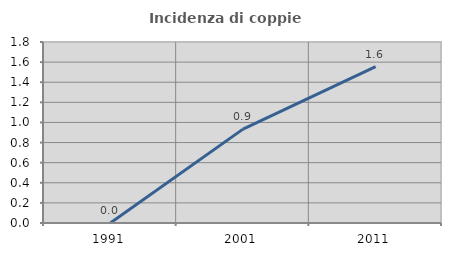
| Category | Incidenza di coppie miste |
|---|---|
| 1991.0 | 0 |
| 2001.0 | 0.933 |
| 2011.0 | 1.554 |